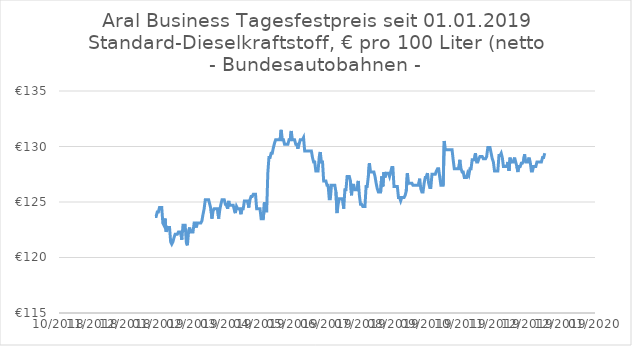
| Category | Series 0 |
|---|---|
| 43815.0 | 129.4 |
| 43814.0 | 129 |
| 43813.0 | 129 |
| 43812.0 | 128.6 |
| 43811.0 | 128.6 |
| 43810.0 | 128.6 |
| 43809.0 | 128.6 |
| 43808.0 | 128.6 |
| 43807.0 | 128.2 |
| 43806.0 | 128.2 |
| 43805.0 | 128.2 |
| 43804.0 | 127.8 |
| 43803.0 | 127.8 |
| 43802.0 | 128.6 |
| 43801.0 | 129 |
| 43800.0 | 128.6 |
| 43799.0 | 128.6 |
| 43798.0 | 128.6 |
| 43797.0 | 129.3 |
| 43796.0 | 128.7 |
| 43795.0 | 128.5 |
| 43794.0 | 128.5 |
| 43793.0 | 128.2 |
| 43792.0 | 128.2 |
| 43791.0 | 127.7 |
| 43790.0 | 128.2 |
| 43789.0 | 128.6 |
| 43788.0 | 129 |
| 43787.0 | 128.6 |
| 43786.0 | 128.6 |
| 43785.0 | 128.6 |
| 43784.0 | 129 |
| 43783.0 | 127.8 |
| 43782.0 | 128.6 |
| 43781.0 | 128.2 |
| 43780.0 | 128.2 |
| 43779.0 | 128.2 |
| 43778.0 | 128.2 |
| 43777.0 | 129 |
| 43776.0 | 129.4 |
| 43775.0 | 129.2 |
| 43774.0 | 129.2 |
| 43773.0 | 127.8 |
| 43772.0 | 127.8 |
| 43771.0 | 127.8 |
| 43770.0 | 127.8 |
| 43769.0 | 128.6 |
| 43768.0 | 128.9 |
| 43767.0 | 129.4 |
| 43766.0 | 129.9 |
| 43765.0 | 129.9 |
| 43764.0 | 129.9 |
| 43763.0 | 129.1 |
| 43762.0 | 128.9 |
| 43761.0 | 128.9 |
| 43760.0 | 128.9 |
| 43759.0 | 129.1 |
| 43758.0 | 129.1 |
| 43757.0 | 129.1 |
| 43756.0 | 128.9 |
| 43755.0 | 128.6 |
| 43754.0 | 128.6 |
| 43753.0 | 129.4 |
| 43752.0 | 128.8 |
| 43751.0 | 128.8 |
| 43750.0 | 128.8 |
| 43749.0 | 128 |
| 43748.0 | 128 |
| 43747.0 | 127.4 |
| 43746.0 | 127.6 |
| 43745.0 | 127.2 |
| 43744.0 | 127.2 |
| 43743.0 | 127.2 |
| 43742.0 | 127.7 |
| 43741.0 | 127.7 |
| 43740.0 | 128 |
| 43739.0 | 128.8 |
| 43738.0 | 128 |
| 43737.0 | 128 |
| 43736.0 | 128 |
| 43735.0 | 128 |
| 43734.0 | 128 |
| 43733.0 | 128.8 |
| 43732.0 | 129.7 |
| 43731.0 | 129.7 |
| 43730.0 | 129.7 |
| 43729.0 | 129.7 |
| 43728.0 | 129.7 |
| 43727.0 | 129.7 |
| 43726.0 | 129.7 |
| 43725.0 | 130.5 |
| 43724.0 | 126.5 |
| 43723.0 | 126.5 |
| 43722.0 | 126.5 |
| 43721.0 | 127.2 |
| 43720.0 | 128 |
| 43719.0 | 128 |
| 43718.0 | 127.8 |
| 43717.0 | 127.5 |
| 43716.0 | 127.5 |
| 43715.0 | 127.5 |
| 43714.0 | 127.5 |
| 43713.0 | 126.3 |
| 43712.0 | 126.3 |
| 43711.0 | 126.7 |
| 43710.0 | 127.6 |
| 43709.0 | 127.2 |
| 43708.0 | 127.2 |
| 43707.0 | 126.7 |
| 43706.0 | 125.9 |
| 43705.0 | 125.9 |
| 43704.0 | 126.2 |
| 43703.0 | 127.1 |
| 43702.0 | 126.5 |
| 43701.0 | 126.5 |
| 43700.0 | 126.5 |
| 43699.0 | 126.5 |
| 43698.0 | 126.5 |
| 43697.0 | 126.5 |
| 43696.0 | 126.7 |
| 43695.0 | 126.7 |
| 43694.0 | 126.7 |
| 43693.0 | 126.7 |
| 43692.0 | 127.6 |
| 43691.0 | 126 |
| 43690.0 | 125.6 |
| 43689.0 | 125.4 |
| 43688.0 | 125.4 |
| 43687.0 | 125.4 |
| 43686.0 | 125.1 |
| 43685.0 | 125.4 |
| 43684.0 | 125.4 |
| 43683.0 | 126.4 |
| 43682.0 | 126.4 |
| 43681.0 | 126.4 |
| 43680.0 | 126.4 |
| 43679.0 | 128.1 |
| 43678.0 | 128.1 |
| 43677.0 | 127.7 |
| 43676.0 | 127.3 |
| 43675.0 | 127.6 |
| 43674.0 | 127.6 |
| 43673.0 | 127.6 |
| 43672.0 | 127.2 |
| 43671.0 | 127.7 |
| 43670.0 | 126.4 |
| 43669.0 | 127.3 |
| 43668.0 | 125.9 |
| 43667.0 | 125.9 |
| 43666.0 | 125.9 |
| 43665.0 | 126.2 |
| 43664.0 | 126.7 |
| 43663.0 | 127.3 |
| 43662.0 | 127.7 |
| 43661.0 | 127.7 |
| 43660.0 | 127.7 |
| 43659.0 | 127.7 |
| 43658.0 | 128.5 |
| 43657.0 | 127.3 |
| 43656.0 | 126.4 |
| 43655.0 | 126.4 |
| 43654.0 | 124.6 |
| 43653.0 | 124.6 |
| 43652.0 | 124.6 |
| 43651.0 | 124.8 |
| 43650.0 | 124.8 |
| 43649.0 | 125.6 |
| 43648.0 | 126.9 |
| 43647.0 | 126.1 |
| 43646.0 | 126.1 |
| 43645.0 | 126.1 |
| 43644.0 | 126.5 |
| 43643.0 | 126.5 |
| 43642.0 | 125.6 |
| 43641.0 | 126.9 |
| 43640.0 | 127.3 |
| 43639.0 | 127.3 |
| 43638.0 | 127.3 |
| 43637.0 | 126.1 |
| 43636.0 | 126.1 |
| 43635.0 | 124.4 |
| 43634.0 | 125.3 |
| 43633.0 | 125.3 |
| 43632.0 | 125.3 |
| 43631.0 | 125.3 |
| 43630.0 | 124.8 |
| 43629.0 | 124 |
| 43628.0 | 125.9 |
| 43627.0 | 126.5 |
| 43626.0 | 126.5 |
| 43625.0 | 126.5 |
| 43624.0 | 126.5 |
| 43623.0 | 125.3 |
| 43622.0 | 125.3 |
| 43621.0 | 126.5 |
| 43620.0 | 126.5 |
| 43619.0 | 126.9 |
| 43618.0 | 126.9 |
| 43617.0 | 126.9 |
| 43616.0 | 128.6 |
| 43615.0 | 128.6 |
| 43614.0 | 129.5 |
| 43613.0 | 129 |
| 43612.0 | 127.8 |
| 43611.0 | 127.8 |
| 43610.0 | 127.8 |
| 43609.0 | 128.6 |
| 43608.0 | 128.6 |
| 43607.0 | 129 |
| 43606.0 | 129.6 |
| 43605.0 | 129.6 |
| 43604.0 | 129.6 |
| 43603.0 | 129.6 |
| 43602.0 | 129.6 |
| 43601.0 | 129.6 |
| 43600.0 | 129.6 |
| 43599.0 | 130.8 |
| 43598.0 | 130.6 |
| 43597.0 | 130.6 |
| 43596.0 | 130.6 |
| 43595.0 | 130.2 |
| 43594.0 | 129.8 |
| 43593.0 | 130.2 |
| 43592.0 | 130.2 |
| 43591.0 | 130.6 |
| 43590.0 | 130.6 |
| 43589.0 | 130.6 |
| 43588.0 | 131.4 |
| 43587.0 | 130.6 |
| 43586.0 | 130.6 |
| 43585.0 | 130.2 |
| 43584.0 | 130.2 |
| 43583.0 | 130.2 |
| 43582.0 | 130.2 |
| 43581.0 | 130.6 |
| 43580.0 | 130.6 |
| 43579.0 | 131.5 |
| 43578.0 | 130.6 |
| 43577.0 | 130.6 |
| 43576.0 | 130.6 |
| 43575.0 | 130.6 |
| 43574.0 | 130.6 |
| 43573.0 | 130.3 |
| 43572.0 | 129.9 |
| 43571.0 | 129.4 |
| 43570.0 | 129.4 |
| 43569.0 | 129 |
| 43568.0 | 129 |
| 43567.0 | 127.6 |
| 43566.0 | 124.2 |
| 43565.0 | 124.2 |
| 43564.0 | 125 |
| 43563.0 | 123.5 |
| 43562.0 | 123.5 |
| 43561.0 | 123.5 |
| 43560.0 | 124.4 |
| 43559.0 | 124.4 |
| 43558.0 | 124.4 |
| 43557.0 | 124.4 |
| 43556.0 | 125.7 |
| 43555.0 | 125.7 |
| 43554.0 | 125.7 |
| 43553.0 | 125.5 |
| 43552.0 | 125.5 |
| 43551.0 | 125.2 |
| 43550.0 | 124.5 |
| 43549.0 | 125.1 |
| 43548.0 | 125.1 |
| 43547.0 | 125.1 |
| 43546.0 | 125.1 |
| 43545.0 | 124.4 |
| 43544.0 | 124.4 |
| 43543.0 | 123.9 |
| 43542.0 | 124.4 |
| 43541.0 | 124.4 |
| 43540.0 | 124.4 |
| 43539.0 | 124.6 |
| 43538.0 | 124 |
| 43537.0 | 124.3 |
| 43536.0 | 124.7 |
| 43535.0 | 124.7 |
| 43534.0 | 124.7 |
| 43533.0 | 124.7 |
| 43532.0 | 125.1 |
| 43531.0 | 124.4 |
| 43530.0 | 124.8 |
| 43529.0 | 124.8 |
| 43528.0 | 125.2 |
| 43527.0 | 125.2 |
| 43526.0 | 125.2 |
| 43525.0 | 124.8 |
| 43524.0 | 124.3 |
| 43523.0 | 123.5 |
| 43522.0 | 124.4 |
| 43521.0 | 124.4 |
| 43520.0 | 124.4 |
| 43519.0 | 124.4 |
| 43518.0 | 124.2 |
| 43517.0 | 123.5 |
| 43516.0 | 124.4 |
| 43515.0 | 124.8 |
| 43514.0 | 125.2 |
| 43513.0 | 125.2 |
| 43512.0 | 125.2 |
| 43511.0 | 125.2 |
| 43510.0 | 124.4 |
| 43509.0 | 123.9 |
| 43508.0 | 123.3 |
| 43507.0 | 123.1 |
| 43506.0 | 123.1 |
| 43505.0 | 123.1 |
| 43504.0 | 123.1 |
| 43503.0 | 122.7 |
| 43502.0 | 123.1 |
| 43501.0 | 123.1 |
| 43500.0 | 122.3 |
| 43499.0 | 122.3 |
| 43498.0 | 122.3 |
| 43497.0 | 122.7 |
| 43496.0 | 122.3 |
| 43495.0 | 121.1 |
| 43494.0 | 121.4 |
| 43493.0 | 122.9 |
| 43492.0 | 122.9 |
| 43491.0 | 122.9 |
| 43490.0 | 121.6 |
| 43489.0 | 122.3 |
| 43488.0 | 122.3 |
| 43487.0 | 122.3 |
| 43486.0 | 122.1 |
| 43485.0 | 122.1 |
| 43484.0 | 122.1 |
| 43483.0 | 121.8 |
| 43482.0 | 121.4 |
| 43481.0 | 121.2 |
| 43480.0 | 121.4 |
| 43479.0 | 122.7 |
| 43478.0 | 122.7 |
| 43477.0 | 122.7 |
| 43476.0 | 122.3 |
| 43475.0 | 123.5 |
| 43474.0 | 122.9 |
| 43473.0 | 123.1 |
| 43472.0 | 124.5 |
| 43471.0 | 124.5 |
| 43470.0 | 124.5 |
| 43469.0 | 124.1 |
| 43468.0 | 124.1 |
| 43467.0 | 123.7 |
| 43466.0 | 123.7 |